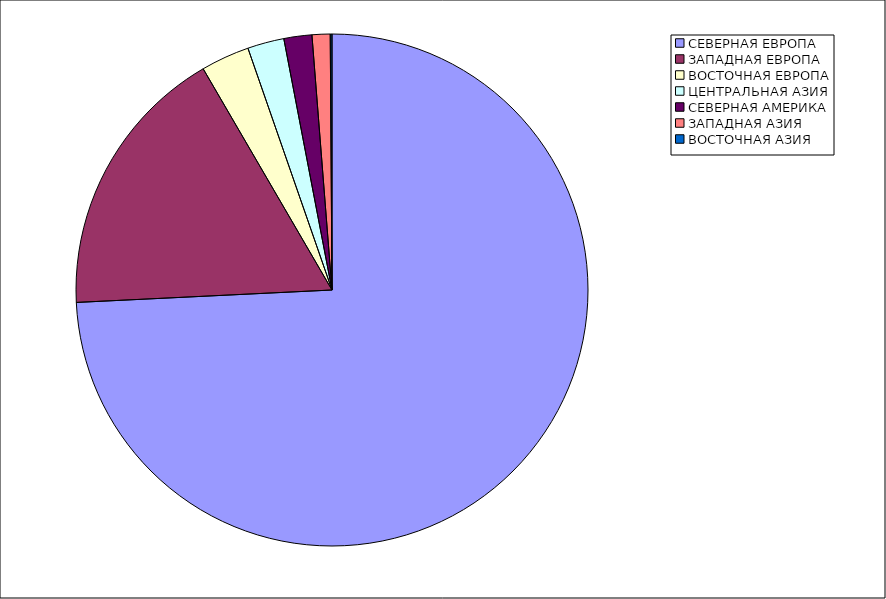
| Category | Оборот |
|---|---|
| СЕВЕРНАЯ ЕВРОПА | 74.225 |
| ЗАПАДНАЯ ЕВРОПА | 17.382 |
| ВОСТОЧНАЯ ЕВРОПА | 3.068 |
| ЦЕНТРАЛЬНАЯ АЗИЯ | 2.308 |
| СЕВЕРНАЯ АМЕРИКА | 1.767 |
| ЗАПАДНАЯ АЗИЯ | 1.14 |
| ВОСТОЧНАЯ АЗИЯ | 0.11 |